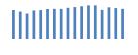
| Category | Exportações (1) |
|---|---|
| 0 | 392293.987 |
| 1 | 370979.678 |
| 2 | 344221.998 |
| 3 | 386156.652 |
| 4 | 390987.572 |
| 5 | 406063.094 |
| 6 | 407598.054 |
| 7 | 406953.169 |
| 8 | 421887.391 |
| 9 | 431264.801 |
| 10 | 442364.452 |
| 11 | 454202.095 |
| 12 | 454929.952 |
| 13 | 393954.142 |
| 14 | 427968.658 |
| 15 | 418166.49 |
| 16 | 407784.359 |